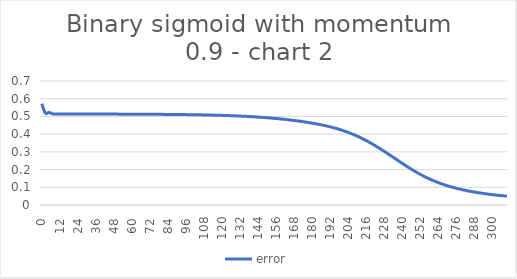
| Category | error |
|---|---|
| 0.0 | 0.572 |
| 1.0 | 0.547 |
| 2.0 | 0.523 |
| 3.0 | 0.516 |
| 4.0 | 0.52 |
| 5.0 | 0.523 |
| 6.0 | 0.52 |
| 7.0 | 0.515 |
| 8.0 | 0.514 |
| 9.0 | 0.514 |
| 10.0 | 0.514 |
| 11.0 | 0.514 |
| 12.0 | 0.514 |
| 13.0 | 0.514 |
| 14.0 | 0.514 |
| 15.0 | 0.514 |
| 16.0 | 0.514 |
| 17.0 | 0.514 |
| 18.0 | 0.514 |
| 19.0 | 0.514 |
| 20.0 | 0.514 |
| 21.0 | 0.514 |
| 22.0 | 0.514 |
| 23.0 | 0.514 |
| 24.0 | 0.514 |
| 25.0 | 0.514 |
| 26.0 | 0.514 |
| 27.0 | 0.514 |
| 28.0 | 0.514 |
| 29.0 | 0.514 |
| 30.0 | 0.513 |
| 31.0 | 0.513 |
| 32.0 | 0.513 |
| 33.0 | 0.513 |
| 34.0 | 0.513 |
| 35.0 | 0.513 |
| 36.0 | 0.513 |
| 37.0 | 0.513 |
| 38.0 | 0.513 |
| 39.0 | 0.513 |
| 40.0 | 0.513 |
| 41.0 | 0.513 |
| 42.0 | 0.513 |
| 43.0 | 0.513 |
| 44.0 | 0.513 |
| 45.0 | 0.513 |
| 46.0 | 0.513 |
| 47.0 | 0.513 |
| 48.0 | 0.513 |
| 49.0 | 0.513 |
| 50.0 | 0.513 |
| 51.0 | 0.513 |
| 52.0 | 0.513 |
| 53.0 | 0.513 |
| 54.0 | 0.513 |
| 55.0 | 0.513 |
| 56.0 | 0.513 |
| 57.0 | 0.513 |
| 58.0 | 0.513 |
| 59.0 | 0.513 |
| 60.0 | 0.513 |
| 61.0 | 0.513 |
| 62.0 | 0.513 |
| 63.0 | 0.513 |
| 64.0 | 0.513 |
| 65.0 | 0.512 |
| 66.0 | 0.512 |
| 67.0 | 0.512 |
| 68.0 | 0.512 |
| 69.0 | 0.512 |
| 70.0 | 0.512 |
| 71.0 | 0.512 |
| 72.0 | 0.512 |
| 73.0 | 0.512 |
| 74.0 | 0.512 |
| 75.0 | 0.512 |
| 76.0 | 0.512 |
| 77.0 | 0.512 |
| 78.0 | 0.512 |
| 79.0 | 0.512 |
| 80.0 | 0.512 |
| 81.0 | 0.512 |
| 82.0 | 0.512 |
| 83.0 | 0.511 |
| 84.0 | 0.511 |
| 85.0 | 0.511 |
| 86.0 | 0.511 |
| 87.0 | 0.511 |
| 88.0 | 0.511 |
| 89.0 | 0.511 |
| 90.0 | 0.511 |
| 91.0 | 0.511 |
| 92.0 | 0.511 |
| 93.0 | 0.511 |
| 94.0 | 0.51 |
| 95.0 | 0.51 |
| 96.0 | 0.51 |
| 97.0 | 0.51 |
| 98.0 | 0.51 |
| 99.0 | 0.51 |
| 100.0 | 0.51 |
| 101.0 | 0.51 |
| 102.0 | 0.509 |
| 103.0 | 0.509 |
| 104.0 | 0.509 |
| 105.0 | 0.509 |
| 106.0 | 0.509 |
| 107.0 | 0.509 |
| 108.0 | 0.509 |
| 109.0 | 0.508 |
| 110.0 | 0.508 |
| 111.0 | 0.508 |
| 112.0 | 0.508 |
| 113.0 | 0.508 |
| 114.0 | 0.507 |
| 115.0 | 0.507 |
| 116.0 | 0.507 |
| 117.0 | 0.507 |
| 118.0 | 0.506 |
| 119.0 | 0.506 |
| 120.0 | 0.506 |
| 121.0 | 0.506 |
| 122.0 | 0.505 |
| 123.0 | 0.505 |
| 124.0 | 0.505 |
| 125.0 | 0.505 |
| 126.0 | 0.504 |
| 127.0 | 0.504 |
| 128.0 | 0.504 |
| 129.0 | 0.503 |
| 130.0 | 0.503 |
| 131.0 | 0.502 |
| 132.0 | 0.502 |
| 133.0 | 0.502 |
| 134.0 | 0.501 |
| 135.0 | 0.501 |
| 136.0 | 0.5 |
| 137.0 | 0.5 |
| 138.0 | 0.5 |
| 139.0 | 0.499 |
| 140.0 | 0.499 |
| 141.0 | 0.498 |
| 142.0 | 0.498 |
| 143.0 | 0.497 |
| 144.0 | 0.496 |
| 145.0 | 0.496 |
| 146.0 | 0.495 |
| 147.0 | 0.495 |
| 148.0 | 0.494 |
| 149.0 | 0.493 |
| 150.0 | 0.493 |
| 151.0 | 0.492 |
| 152.0 | 0.491 |
| 153.0 | 0.491 |
| 154.0 | 0.49 |
| 155.0 | 0.489 |
| 156.0 | 0.488 |
| 157.0 | 0.488 |
| 158.0 | 0.487 |
| 159.0 | 0.486 |
| 160.0 | 0.485 |
| 161.0 | 0.484 |
| 162.0 | 0.483 |
| 163.0 | 0.482 |
| 164.0 | 0.481 |
| 165.0 | 0.48 |
| 166.0 | 0.479 |
| 167.0 | 0.478 |
| 168.0 | 0.477 |
| 169.0 | 0.476 |
| 170.0 | 0.475 |
| 171.0 | 0.474 |
| 172.0 | 0.473 |
| 173.0 | 0.472 |
| 174.0 | 0.47 |
| 175.0 | 0.469 |
| 176.0 | 0.468 |
| 177.0 | 0.467 |
| 178.0 | 0.465 |
| 179.0 | 0.464 |
| 180.0 | 0.462 |
| 181.0 | 0.461 |
| 182.0 | 0.459 |
| 183.0 | 0.458 |
| 184.0 | 0.456 |
| 185.0 | 0.455 |
| 186.0 | 0.453 |
| 187.0 | 0.451 |
| 188.0 | 0.449 |
| 189.0 | 0.447 |
| 190.0 | 0.446 |
| 191.0 | 0.444 |
| 192.0 | 0.441 |
| 193.0 | 0.439 |
| 194.0 | 0.437 |
| 195.0 | 0.435 |
| 196.0 | 0.432 |
| 197.0 | 0.43 |
| 198.0 | 0.427 |
| 199.0 | 0.425 |
| 200.0 | 0.422 |
| 201.0 | 0.419 |
| 202.0 | 0.416 |
| 203.0 | 0.413 |
| 204.0 | 0.41 |
| 205.0 | 0.407 |
| 206.0 | 0.404 |
| 207.0 | 0.4 |
| 208.0 | 0.396 |
| 209.0 | 0.393 |
| 210.0 | 0.389 |
| 211.0 | 0.385 |
| 212.0 | 0.381 |
| 213.0 | 0.377 |
| 214.0 | 0.373 |
| 215.0 | 0.368 |
| 216.0 | 0.364 |
| 217.0 | 0.359 |
| 218.0 | 0.355 |
| 219.0 | 0.35 |
| 220.0 | 0.345 |
| 221.0 | 0.34 |
| 222.0 | 0.335 |
| 223.0 | 0.33 |
| 224.0 | 0.325 |
| 225.0 | 0.32 |
| 226.0 | 0.314 |
| 227.0 | 0.309 |
| 228.0 | 0.303 |
| 229.0 | 0.298 |
| 230.0 | 0.292 |
| 231.0 | 0.287 |
| 232.0 | 0.281 |
| 233.0 | 0.275 |
| 234.0 | 0.27 |
| 235.0 | 0.264 |
| 236.0 | 0.258 |
| 237.0 | 0.253 |
| 238.0 | 0.247 |
| 239.0 | 0.241 |
| 240.0 | 0.236 |
| 241.0 | 0.23 |
| 242.0 | 0.224 |
| 243.0 | 0.219 |
| 244.0 | 0.214 |
| 245.0 | 0.208 |
| 246.0 | 0.203 |
| 247.0 | 0.198 |
| 248.0 | 0.193 |
| 249.0 | 0.188 |
| 250.0 | 0.183 |
| 251.0 | 0.178 |
| 252.0 | 0.173 |
| 253.0 | 0.169 |
| 254.0 | 0.164 |
| 255.0 | 0.16 |
| 256.0 | 0.156 |
| 257.0 | 0.152 |
| 258.0 | 0.148 |
| 259.0 | 0.144 |
| 260.0 | 0.14 |
| 261.0 | 0.137 |
| 262.0 | 0.133 |
| 263.0 | 0.13 |
| 264.0 | 0.127 |
| 265.0 | 0.123 |
| 266.0 | 0.12 |
| 267.0 | 0.117 |
| 268.0 | 0.115 |
| 269.0 | 0.112 |
| 270.0 | 0.109 |
| 271.0 | 0.106 |
| 272.0 | 0.104 |
| 273.0 | 0.102 |
| 274.0 | 0.099 |
| 275.0 | 0.097 |
| 276.0 | 0.095 |
| 277.0 | 0.093 |
| 278.0 | 0.091 |
| 279.0 | 0.089 |
| 280.0 | 0.087 |
| 281.0 | 0.085 |
| 282.0 | 0.083 |
| 283.0 | 0.081 |
| 284.0 | 0.079 |
| 285.0 | 0.078 |
| 286.0 | 0.076 |
| 287.0 | 0.075 |
| 288.0 | 0.073 |
| 289.0 | 0.072 |
| 290.0 | 0.07 |
| 291.0 | 0.069 |
| 292.0 | 0.068 |
| 293.0 | 0.066 |
| 294.0 | 0.065 |
| 295.0 | 0.064 |
| 296.0 | 0.063 |
| 297.0 | 0.062 |
| 298.0 | 0.061 |
| 299.0 | 0.06 |
| 300.0 | 0.059 |
| 301.0 | 0.058 |
| 302.0 | 0.057 |
| 303.0 | 0.056 |
| 304.0 | 0.055 |
| 305.0 | 0.054 |
| 306.0 | 0.053 |
| 307.0 | 0.052 |
| 308.0 | 0.051 |
| 309.0 | 0.05 |
| 310.0 | 0.05 |